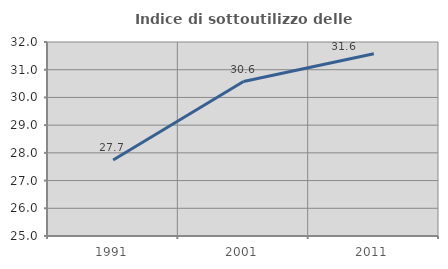
| Category | Indice di sottoutilizzo delle abitazioni  |
|---|---|
| 1991.0 | 27.742 |
| 2001.0 | 30.573 |
| 2011.0 | 31.579 |